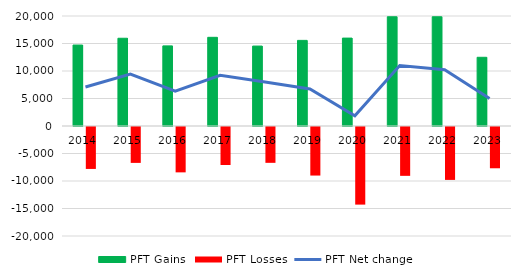
| Category | PFT Gains  | PFT Losses |
|---|---|---|
| 2014.0 | 14720 | -7625 |
| 2015.0 | 15952 | -6526 |
| 2016.0 | 14564 | -8248 |
| 2017.0 | 16125 | -6906 |
| 2018.0 | 14534 | -6515 |
| 2019.0 | 15566 | -8829 |
| 2020.0 | 15982 | -14111 |
| 2021.0 | 19863 | -8881 |
| 2022.0 | 19863 | -9621 |
| 2023.0 | 12493 | -7505 |